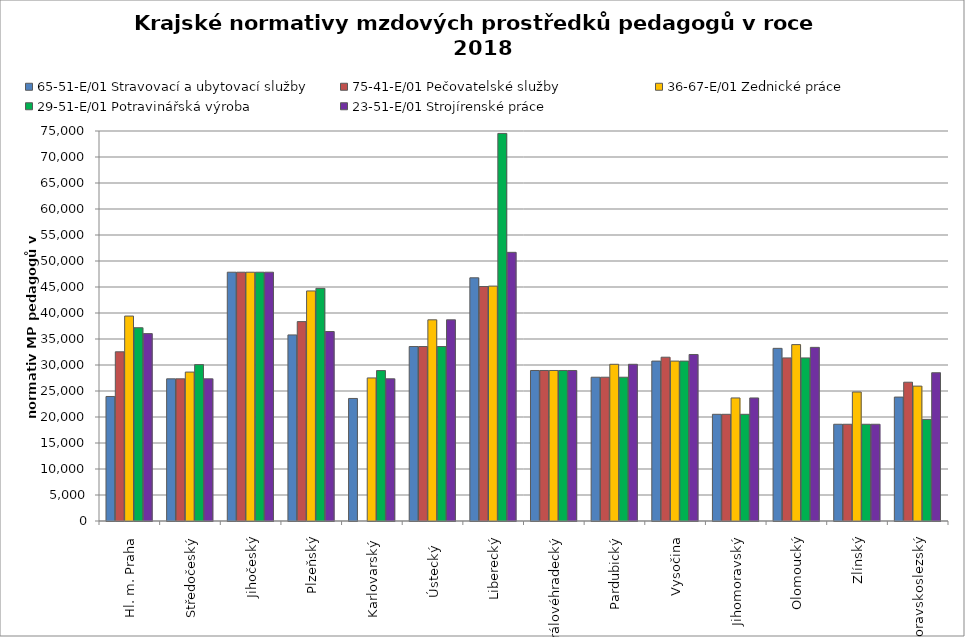
| Category | 65-51-E/01 Stravovací a ubytovací služby | 75-41-E/01 Pečovatelské služby | 36-67-E/01 Zednické práce | 29-51-E/01 Potravinářská výroba | 23-51-E/01 Strojírenské práce |
|---|---|---|---|---|---|
| Hl. m. Praha | 23946.835 | 32533.104 | 39412.5 | 37166.994 | 36034.286 |
| Středočeský | 27338.982 | 27338.982 | 28640.839 | 30072.88 | 27338.982 |
| Jihočeský | 47845.482 | 47845.482 | 47845.482 | 47845.482 | 47845.482 |
| Plzeňský | 35783.589 | 38342.029 | 44240.803 | 44739.572 | 36440.771 |
| Karlovarský  | 23565.891 | 0 | 27511.312 | 28929.421 | 27346.327 |
| Ústecký   | 33551.622 | 33551.622 | 38687.075 | 33551.622 | 38687.075 |
| Liberecký | 46767.955 | 45087.466 | 45171.696 | 74532.341 | 51666.187 |
| Královéhradecký | 28942.453 | 28942.453 | 28942.453 | 28942.453 | 28942.453 |
| Pardubický | 27648.571 | 27648.571 | 30135.986 | 27648.571 | 30135.986 |
| Vysočina | 30752.382 | 31498.549 | 30752.382 | 30752.382 | 32019.303 |
| Jihomoravský | 20517.113 | 20517.113 | 23664.794 | 20517.113 | 23664.794 |
| Olomoucký | 33200.326 | 31361.538 | 33918.469 | 31361.538 | 33390.663 |
| Zlínský | 18604.2 | 18604.2 | 24805.6 | 18604.2 | 18604.2 |
| Moravskoslezský | 23833.858 | 26689.218 | 25939.726 | 19541.796 | 28511.561 |